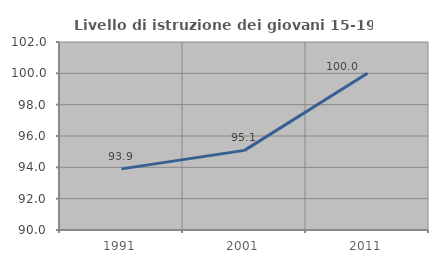
| Category | Livello di istruzione dei giovani 15-19 anni |
|---|---|
| 1991.0 | 93.902 |
| 2001.0 | 95.082 |
| 2011.0 | 100 |